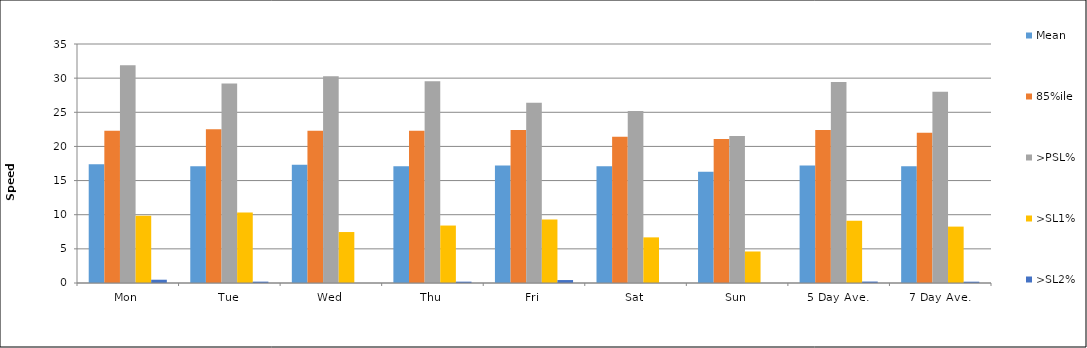
| Category | Mean | 85%ile | >PSL% | >SL1% | >SL2% |
|---|---|---|---|---|---|
| Mon | 17.4 | 22.3 | 31.89 | 9.832 | 0.48 |
| Tue | 17.1 | 22.5 | 29.22 | 10.34 | 0.199 |
| Wed | 17.3 | 22.3 | 30.28 | 7.463 | 0 |
| Thu | 17.1 | 22.3 | 29.55 | 8.415 | 0.196 |
| Fri | 17.2 | 22.4 | 26.41 | 9.307 | 0.433 |
| Sat | 17.1 | 21.4 | 25.17 | 6.682 | 0 |
| Sun | 16.3 | 21.1 | 21.54 | 4.615 | 0 |
| 5 Day Ave. | 17.2 | 22.4 | 29.449 | 9.11 | 0.212 |
| 7 Day Ave. | 17.1 | 22 | 28 | 8.259 | 0.191 |